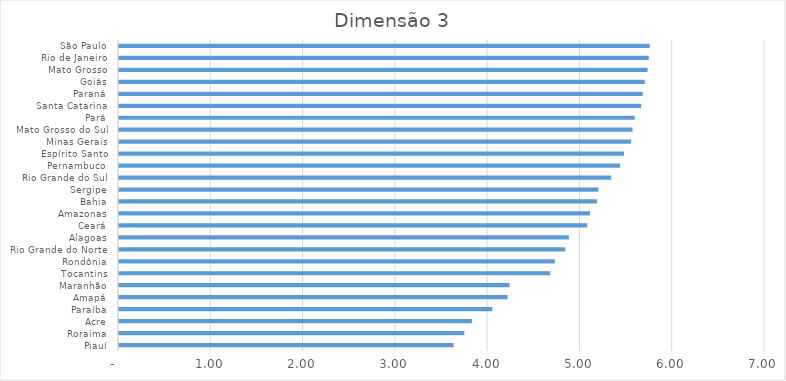
| Category |  Dimensão 3  |
|---|---|
| Piauí | 3.626 |
| Roraima | 3.741 |
| Acre | 3.824 |
| Paraíba | 4.046 |
| Amapá | 4.21 |
| Maranhão | 4.231 |
| Tocantins | 4.672 |
| Rondônia | 4.722 |
| Rio Grande do Norte | 4.836 |
| Alagoas | 4.874 |
| Ceará | 5.073 |
| Amazonas | 5.104 |
| Bahia | 5.179 |
| Sergipe | 5.194 |
| Rio Grande do Sul | 5.333 |
| Pernambuco | 5.43 |
| Espírito Santo | 5.472 |
| Minas Gerais | 5.55 |
| Mato Grosso do Sul | 5.565 |
| Pará | 5.589 |
| Santa Catarina | 5.658 |
| Paraná | 5.675 |
| Goiás | 5.697 |
| Mato Grosso | 5.727 |
| Rio de Janeiro | 5.74 |
| São Paulo | 5.751 |